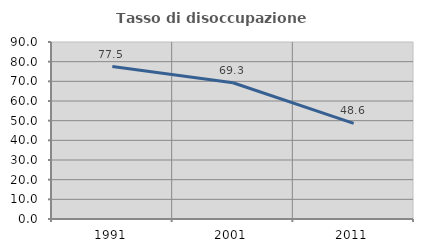
| Category | Tasso di disoccupazione giovanile  |
|---|---|
| 1991.0 | 77.515 |
| 2001.0 | 69.268 |
| 2011.0 | 48.634 |